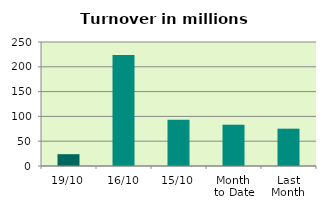
| Category | Series 0 |
|---|---|
| 19/10 | 23.801 |
| 16/10 | 223.823 |
| 15/10 | 93.458 |
| Month 
to Date | 83.244 |
| Last
Month | 75.235 |